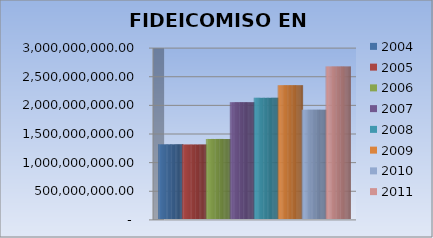
| Category | 2004 | 2005 | 2006 | 2007 | 2008 | 2009 | 2010 | 2011 |
|---|---|---|---|---|---|---|---|---|
| 0 | 1303596013.42 | 1300822919 | 1398151388.42 | 2040634514.67 | 2116373694.05 | 2337548329.03 | 1909688300.82 | 2665005059 |